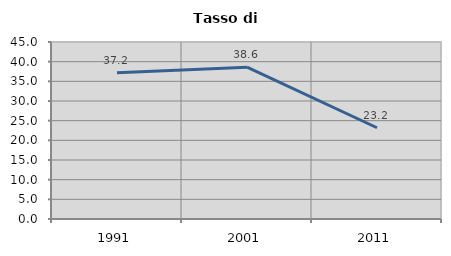
| Category | Tasso di disoccupazione   |
|---|---|
| 1991.0 | 37.197 |
| 2001.0 | 38.594 |
| 2011.0 | 23.195 |